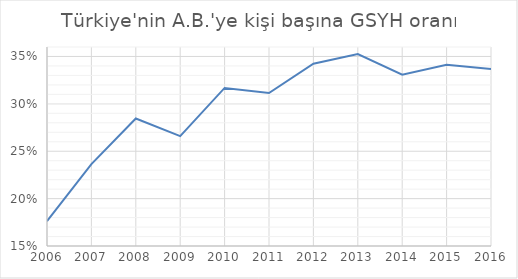
| Category | Türkiye'nin A.B.'ye kişi başına GSYH oranı |
|---|---|
| 2006.0 | 0.176 |
| 2007.0 | 0.236 |
| 2008.0 | 0.285 |
| 2009.0 | 0.266 |
| 2010.0 | 0.317 |
| 2011.0 | 0.311 |
| 2012.0 | 0.342 |
| 2013.0 | 0.352 |
| 2014.0 | 0.331 |
| 2015.0 | 0.341 |
| 2016.0 | 0.337 |